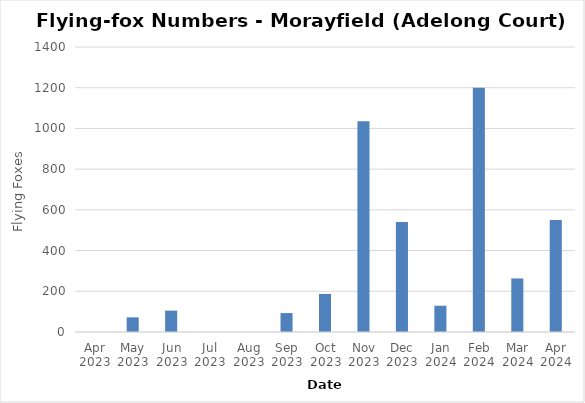
| Category | Flying-foxes |
|---|---|
| Apr 2023 | 0 |
| May 2023 | 72 |
| Jun 2023 | 105 |
| Jul 2023 | 0 |
| Aug 2023 | 0 |
| Sep 2023 | 93 |
| Oct 2023 | 187 |
| Nov 2023 | 1035 |
| Dec 2023 | 540 |
| Jan 2024 | 129 |
| Feb 2024 | 1200 |
| Mar 2024 | 263 |
| Apr 2024 | 550 |